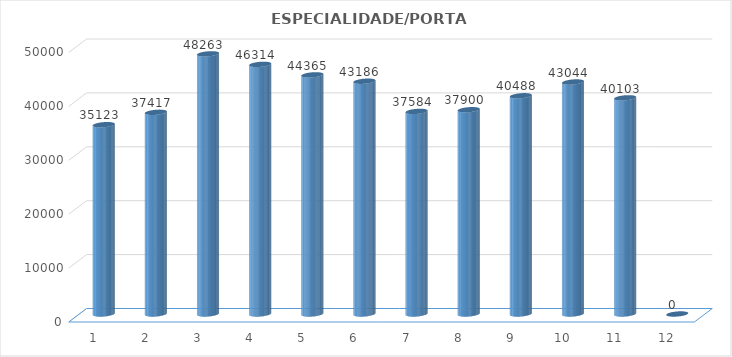
| Category | Series 0 |
|---|---|
| 0 | 35123 |
| 1 | 37417 |
| 2 | 48263 |
| 3 | 46314 |
| 4 | 44365 |
| 5 | 43186 |
| 6 | 37584 |
| 7 | 37900 |
| 8 | 40488 |
| 9 | 43044 |
| 10 | 40103 |
| 11 | 0 |